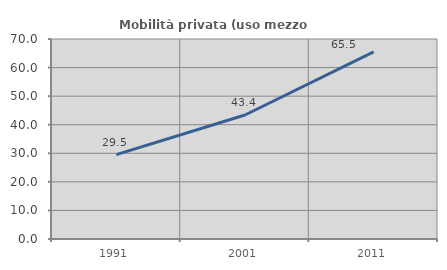
| Category | Mobilità privata (uso mezzo privato) |
|---|---|
| 1991.0 | 29.549 |
| 2001.0 | 43.398 |
| 2011.0 | 65.51 |